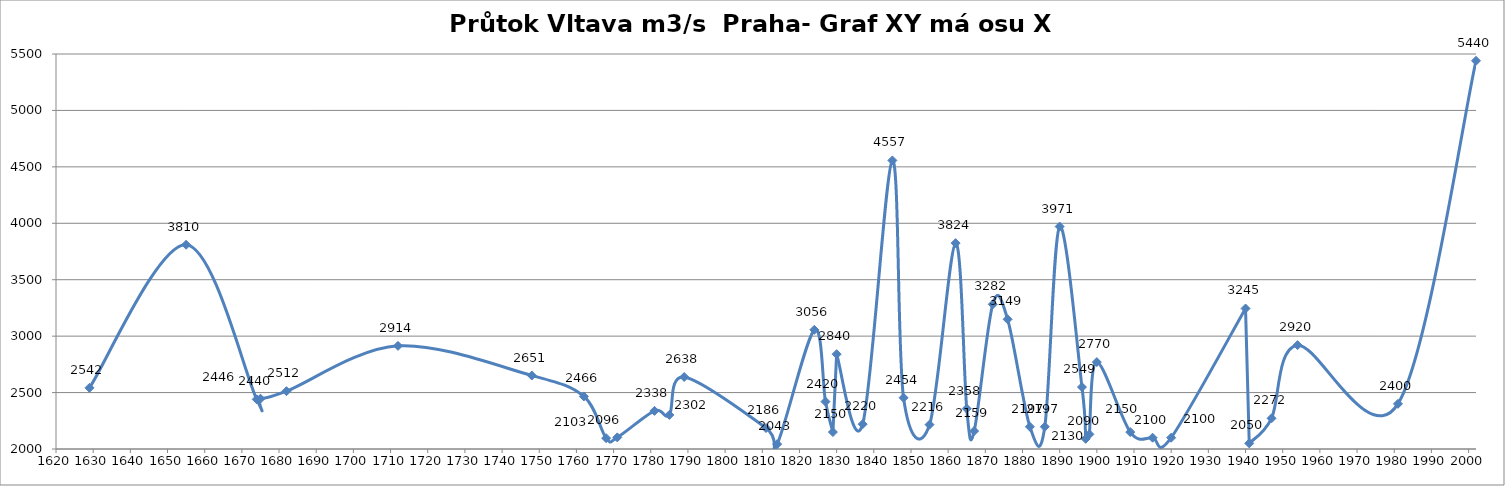
| Category | m3/s  Praha |
|---|---|
| 1629.0 | 2542 |
| 1655.0 | 3810 |
| 1674.0 | 2440 |
| 1675.0 | 2446 |
| 1682.0 | 2512 |
| 1712.0 | 2914 |
| 1748.0 | 2651 |
| 1762.0 | 2466 |
| 1768.0 | 2096 |
| 1771.0 | 2103 |
| 1781.0 | 2338 |
| 1785.0 | 2302 |
| 1789.0 | 2638 |
| 1811.0 | 2186 |
| 1814.0 | 2043 |
| 1824.0 | 3056 |
| 1827.0 | 2420 |
| 1829.0 | 2150 |
| 1830.0 | 2840 |
| 1837.0 | 2220 |
| 1845.0 | 4557 |
| 1848.0 | 2454 |
| 1855.0 | 2216 |
| 1862.0 | 3824 |
| 1865.0 | 2358 |
| 1867.0 | 2159 |
| 1872.0 | 3282 |
| 1876.0 | 3149 |
| 1882.0 | 2197 |
| 1886.0 | 2197 |
| 1890.0 | 3971 |
| 1896.0 | 2549 |
| 1897.0 | 2090 |
| 1898.0 | 2130 |
| 1900.0 | 2770 |
| 1909.0 | 2150 |
| 1915.0 | 2100 |
| 1920.0 | 2100 |
| 1940.0 | 3245 |
| 1941.0 | 2050 |
| 1947.0 | 2272 |
| 1954.0 | 2920 |
| 1981.0 | 2400 |
| 2002.0 | 5440 |